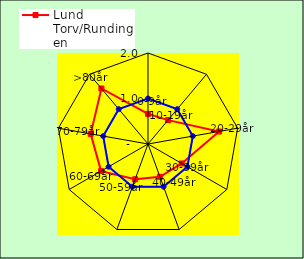
| Category | Lund Torv/Rundingen | Kom. |
|---|---|---|
| 0-9år | 0.662 | 1 |
| 10-19år | 0.684 | 1 |
| 20-29år | 1.586 | 1 |
| 30-39år | 0.855 | 1 |
| 40-49år | 0.767 | 1 |
| 50-59år | 0.825 | 1 |
| 60-69år | 1.191 | 1 |
| 70-79år | 1.279 | 1 |
| >80år | 1.592 | 1 |